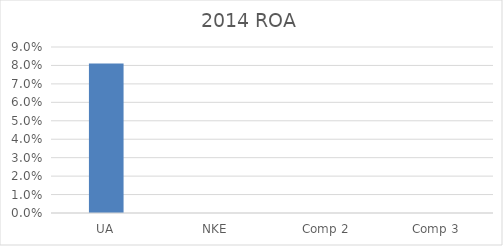
| Category | 2014 ROA |
|---|---|
| UA | 0.081 |
| NKE | 0 |
| Comp 2 | 0 |
| Comp 3 | 0 |